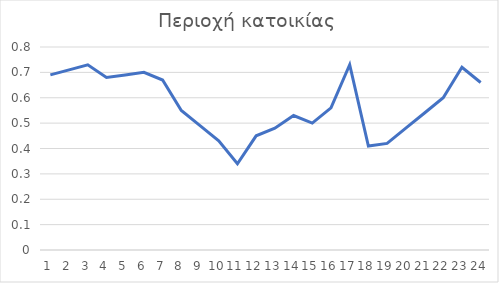
| Category | Series 0 |
|---|---|
| 0 | 0.69 |
| 1 | 0.71 |
| 2 | 0.73 |
| 3 | 0.68 |
| 4 | 0.69 |
| 5 | 0.7 |
| 6 | 0.67 |
| 7 | 0.55 |
| 8 | 0.49 |
| 9 | 0.43 |
| 10 | 0.34 |
| 11 | 0.45 |
| 12 | 0.48 |
| 13 | 0.53 |
| 14 | 0.5 |
| 15 | 0.56 |
| 16 | 0.73 |
| 17 | 0.41 |
| 18 | 0.42 |
| 19 | 0.48 |
| 20 | 0.54 |
| 21 | 0.6 |
| 22 | 0.72 |
| 23 | 0.66 |